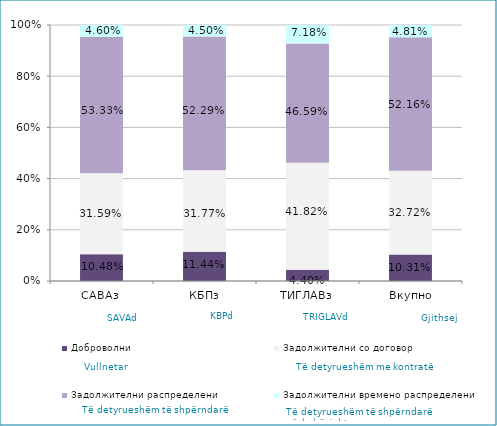
| Category | Доброволни  | Задолжителни со договор  | Задолжителни распределени  | Задолжителни времено распределени  |
|---|---|---|---|---|
| САВАз | 0.105 | 0.316 | 0.533 | 0.046 |
| КБПз | 0.114 | 0.318 | 0.523 | 0.045 |
| ТИГЛАВз | 0.044 | 0.418 | 0.466 | 0.072 |
| Вкупно | 0.103 | 0.327 | 0.522 | 0.048 |